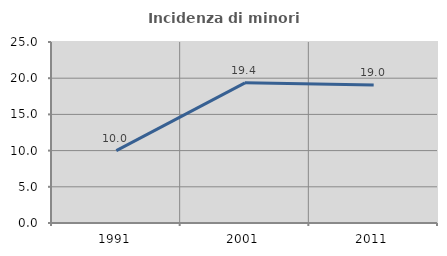
| Category | Incidenza di minori stranieri |
|---|---|
| 1991.0 | 10 |
| 2001.0 | 19.355 |
| 2011.0 | 19.048 |